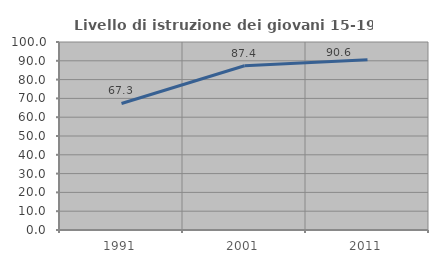
| Category | Livello di istruzione dei giovani 15-19 anni |
|---|---|
| 1991.0 | 67.315 |
| 2001.0 | 87.353 |
| 2011.0 | 90.614 |